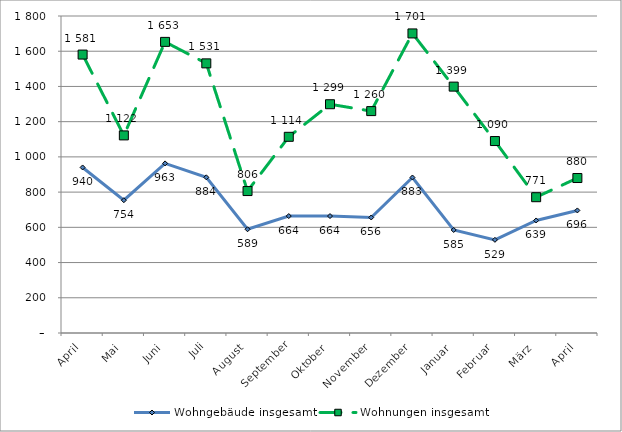
| Category | Wohngebäude insgesamt | Wohnungen insgesamt |
|---|---|---|
| April | 940 | 1581 |
| Mai | 754 | 1122 |
| Juni | 963 | 1653 |
| Juli | 884 | 1531 |
| August | 589 | 806 |
| September | 664 | 1114 |
| Oktober | 664 | 1299 |
| November | 656 | 1260 |
| Dezember | 883 | 1701 |
| Januar | 585 | 1399 |
| Februar | 529 | 1090 |
| März | 639 | 771 |
| April | 696 | 880 |